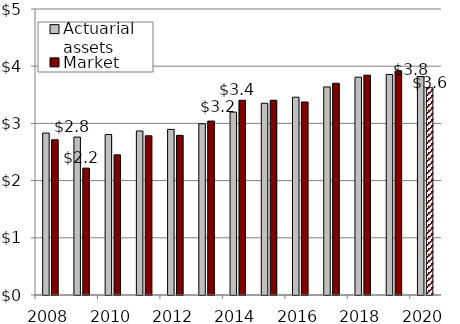
| Category | Actuarial assets | Market assets |
|---|---|---|
| 2008.0 | 2.831 | 2.713 |
| 2009.0 | 2.761 | 2.218 |
| 2010.0 | 2.806 | 2.45 |
| 2011.0 | 2.868 | 2.784 |
| 2012.0 | 2.895 | 2.791 |
| 2013.0 | 2.993 | 3.041 |
| 2014.0 | 3.198 | 3.404 |
| 2015.0 | 3.352 | 3.405 |
| 2016.0 | 3.458 | 3.375 |
| 2017.0 | 3.637 | 3.701 |
| 2018.0 | 3.808 | 3.843 |
| 2019.0 | 3.856 | 3.917 |
| 2020.0 | 3.819 | 3.623 |